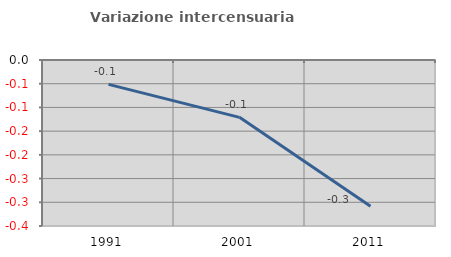
| Category | Variazione intercensuaria annua |
|---|---|
| 1991.0 | -0.051 |
| 2001.0 | -0.121 |
| 2011.0 | -0.309 |